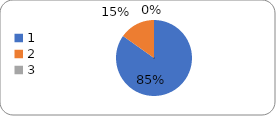
| Category | Series 0 |
|---|---|
| 0 | 95 |
| 1 | 17 |
| 2 | 0 |